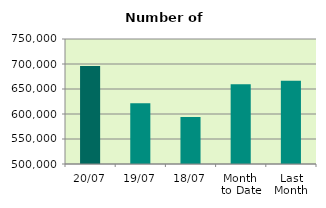
| Category | Series 0 |
|---|---|
| 20/07 | 695758 |
| 19/07 | 621594 |
| 18/07 | 593790 |
| Month 
to Date | 659298.571 |
| Last
Month | 666251.273 |